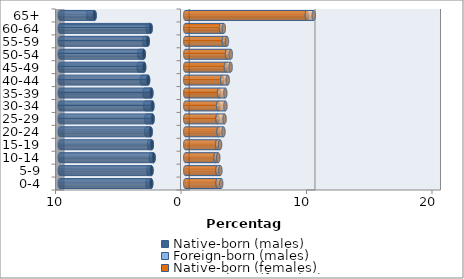
| Category | Native-born (males) | Foreign-born (males) | Native-born (females) | Foreign-born (females) |
|---|---|---|---|---|
| 0-4 | -2.713 | -0.292 | 2.579 | 0.287 |
| 5-9 | -2.691 | -0.24 | 2.564 | 0.236 |
| 10-14 | -2.522 | -0.221 | 2.413 | 0.217 |
| 15-19 | -2.662 | -0.223 | 2.545 | 0.233 |
| 20-24 | -2.758 | -0.352 | 2.65 | 0.394 |
| 25-29 | -2.604 | -0.504 | 2.573 | 0.559 |
| 30-34 | -2.619 | -0.571 | 2.628 | 0.571 |
| 35-39 | -2.702 | -0.547 | 2.691 | 0.504 |
| 40-44 | -2.961 | -0.511 | 2.939 | 0.45 |
| 45-49 | -3.275 | -0.439 | 3.242 | 0.374 |
| 50-54 | -3.307 | -0.36 | 3.329 | 0.303 |
| 55-59 | -2.989 | -0.293 | 3.076 | 0.248 |
| 60-64 | -2.759 | -0.236 | 2.849 | 0.227 |
| 65+ | -7.225 | -0.501 | 9.692 | 0.551 |